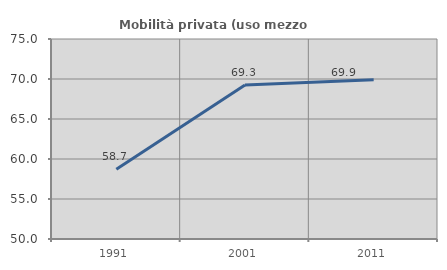
| Category | Mobilità privata (uso mezzo privato) |
|---|---|
| 1991.0 | 58.705 |
| 2001.0 | 69.26 |
| 2011.0 | 69.904 |